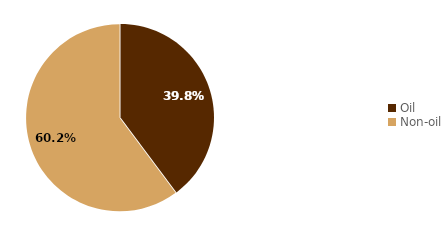
| Category | Series 0 |
|---|---|
| Oil | 39.78 |
| Non-oil | 60.22 |